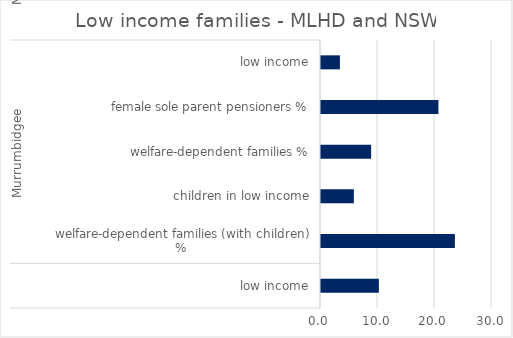
| Category | Total |
|---|---|
| 0 | 10.152 |
| 1 | 23.489 |
| 2 | 5.765 |
| 3 | 8.79 |
| 4 | 20.599 |
| 5 | 3.315 |